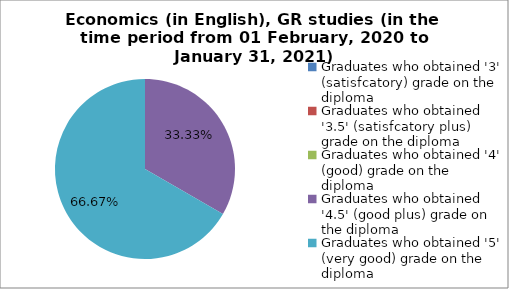
| Category | Series 0 |
|---|---|
| Graduates who obtained '3' (satisfcatory) grade on the diploma | 0 |
| Graduates who obtained '3.5' (satisfcatory plus) grade on the diploma | 0 |
| Graduates who obtained '4' (good) grade on the diploma | 0 |
| Graduates who obtained '4.5' (good plus) grade on the diploma | 33.333 |
| Graduates who obtained '5' (very good) grade on the diploma | 66.667 |